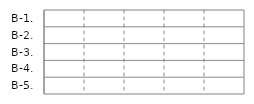
| Category | IN | OUT |
|---|---|---|
| B-1. | 0 | 0 |
| B-2. | 0 | 0 |
| B-3. | 0 | 0 |
| B-4. | 0 | 0 |
| B-5. | 0 | 0 |